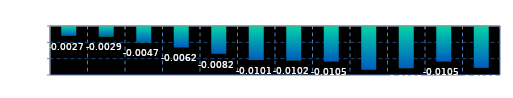
| Category | Series 0 |
|---|---|
| 0 | -0.003 |
| 1 | -0.003 |
| 2 | -0.005 |
| 3 | -0.006 |
| 4 | -0.008 |
| 5 | -0.01 |
| 6 | -0.01 |
| 7 | -0.01 |
| 8 | -0.013 |
| 9 | -0.013 |
| 10 | -0.01 |
| 11 | -0.012 |